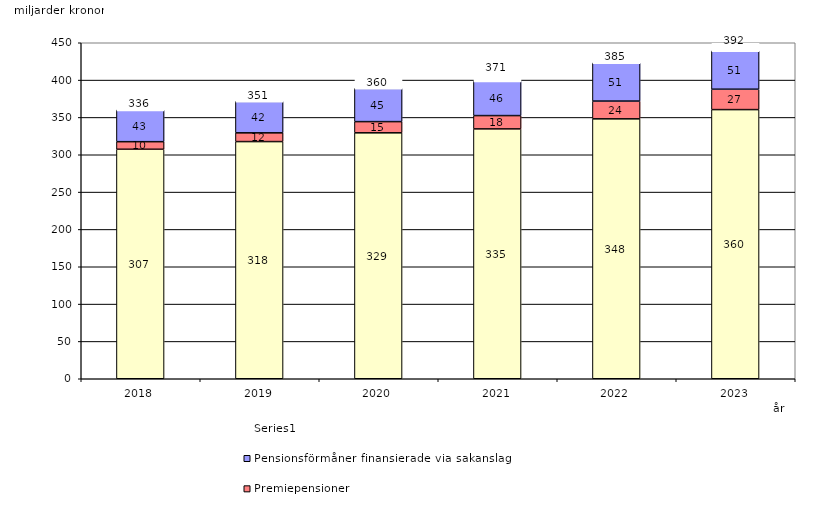
| Category | Inkomstpension och tilläggspension m.m. | Premiepensioner | Pensionsförmåner finansierade via sakanslag | Series 0 |
|---|---|---|---|---|
| 2018.0 | 307.356 | 10.141 | 42.55 | 20 |
| 2019.0 | 317.628 | 11.715 | 42.22 | 20 |
| 2020.0 | 329.365 | 15.016 | 44.546 | 20 |
| 2021.0 | 334.624 | 17.837 | 46.326 | 20 |
| 2022.0 | 348.104 | 23.784 | 51.227 | 20 |
| 2023.0 | 360.459 | 27.307 | 51.44 | 20 |